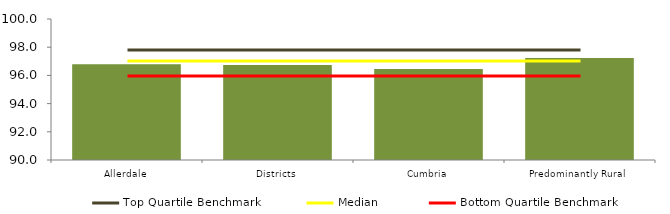
| Category | Block Data |
|---|---|
| Allerdale | 96.79 |
| Districts | 96.743 |
| Cumbria | 96.453 |
|  Predominantly Rural  | 97.241 |